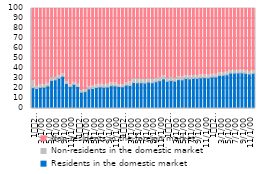
| Category | Residents in the domestic market | Non-residents in the domestic market | Non-residents in the foreign market |
|---|---|---|---|
| 1
2012 | 20.842 | 6.565 | 72.594 |
| 2 | 19.978 | 2.175 | 77.847 |
| 3 | 21.113 | 2.655 | 76.233 |
| 4 | 21.284 | 2.675 | 76.041 |
| 5 | 22.594 | 2.6 | 74.807 |
| 6 | 28.066 | 2.45 | 69.484 |
| 7 | 28.66 | 2.379 | 68.962 |
| 8 | 30.264 | 2.365 | 67.371 |
| 9 | 32.196 | 2.466 | 65.338 |
| 10 | 25.044 | 1.975 | 72.981 |
| 11 | 21.956 | 1.678 | 76.366 |
| 12 | 24.099 | 2.032 | 73.869 |
| 1
2013 | 22.001 | 2.202 | 75.797 |
| 2 | 16.314 | 1.562 | 82.124 |
| 3 | 16.826 | 1.548 | 81.626 |
| 4 | 19.567 | 2.03 | 78.403 |
| 5 | 20.009 | 2.358 | 77.634 |
| 6 | 20.961 | 2.499 | 76.54 |
| 7 | 21.561 | 2.662 | 75.778 |
| 8 | 21.242 | 2.742 | 76.016 |
| 9 | 21.456 | 2.805 | 75.739 |
| 10 | 22.78 | 2.841 | 74.379 |
| 11 | 22.602 | 2.744 | 74.654 |
| 12 | 21.97 | 1.997 | 76.033 |
| 1
2014 | 21.673 | 1.97 | 76.357 |
| 2 | 23.383 | 1.949 | 74.668 |
| 3 | 23.003 | 3.834 | 73.164 |
| 4 | 25.914 | 3.702 | 70.384 |
| 5 | 25.646 | 3.664 | 70.69 |
| 6 | 25.701 | 3.672 | 70.628 |
| 7 | 25.365 | 3.624 | 71.011 |
| 8 | 26.389 | 3.519 | 70.093 |
| 9 | 25.705 | 3.427 | 70.868 |
| 10 | 26.767 | 3.346 | 69.888 |
| 11 | 27.79 | 3.269 | 68.94 |
| 12 | 29.608 | 3.117 | 67.275 |
| 1
2015 | 27.158 | 3.018 | 69.825 |
| 2 | 28.019 | 2.949 | 69.032 |
| 3 | 27.275 | 2.871 | 69.854 |
| 4 | 28.881 | 2.888 | 68.231 |
| 5 | 28.605 | 2.86 | 68.535 |
| 6 | 30.045 | 2.861 | 67.094 |
| 7 | 29.595 | 2.819 | 67.587 |
| 8 | 30.149 | 2.871 | 66.98 |
| 9 | 30.135 | 2.87 | 66.995 |
| 10 | 30.642 | 2.786 | 66.572 |
| 11 | 30.832 | 2.681 | 66.487 |
| 12 | 30.547 | 2.777 | 66.676 |
| 1
2016 | 31.46 | 2.736 | 65.804 |
| 2 | 31.523 | 2.741 | 65.736 |
| 3 | 33.157 | 2.763 | 64.08 |
| 4 | 33.193 | 2.766 | 64.041 |
| 5 | 33.716 | 2.697 | 63.587 |
| 6 | 35.392 | 2.622 | 61.987 |
| 7 | 35.354 | 2.619 | 62.027 |
| 8 | 35.494 | 2.629 | 61.876 |
| 9 | 35.622 | 2.639 | 61.739 |
| 10 | 35.122 | 2.602 | 62.277 |
| 11 | 34.45 | 2.552 | 62.998 |
| 12 | 35.085 | 2.506 | 62.409 |